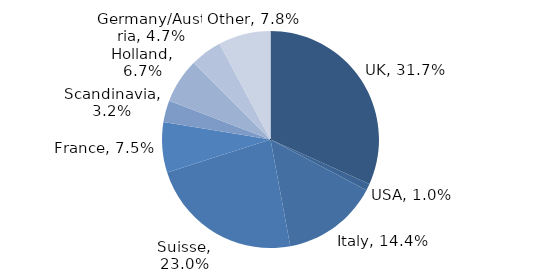
| Category | Investment Style |
|---|---|
| UK | 0.317 |
| USA | 0.01 |
| Italy | 0.144 |
| Suisse | 0.23 |
| France | 0.075 |
| Scandinavia | 0.032 |
| Holland | 0.067 |
| Germany/Austria | 0.047 |
| Other | 0.078 |